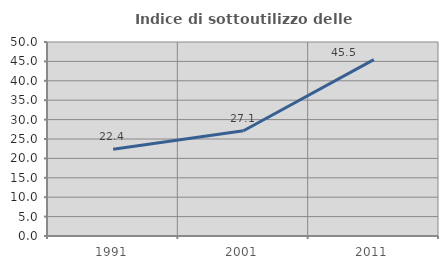
| Category | Indice di sottoutilizzo delle abitazioni  |
|---|---|
| 1991.0 | 22.362 |
| 2001.0 | 27.136 |
| 2011.0 | 45.455 |